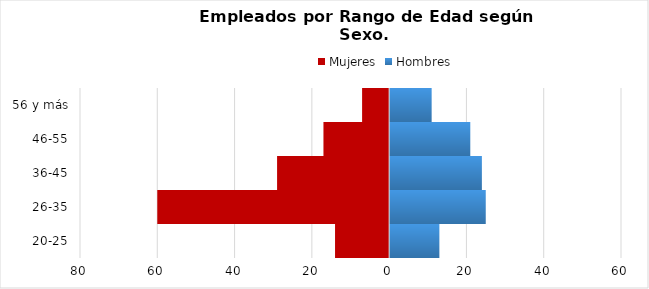
| Category | Mujeres | Hombres |
|---|---|---|
| 20-25 | -14 | 13 |
| 26-35 | -60 | 25 |
| 36-45 | -29 | 24 |
| 46-55 | -17 | 21 |
| 56 y más | -7 | 11 |